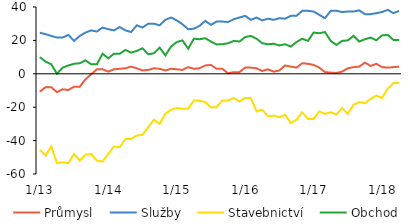
| Category | Průmysl | Služby | Stavebnictví | Obchod |
|---|---|---|---|---|
|  1/13 | -10.7 | 24.6 | -45.5 | 10 |
| 2 | -8 | 23.7 | -49 | 7.3 |
| 3 | -8 | 22.7 | -43.5 | 5.7 |
| 4 | -11 | 21.7 | -53.5 | 0 |
| 5 | -9.3 | 21.7 | -53 | 3.7 |
| 6 | -9.7 | 23.3 | -53.5 | 5 |
| 7 | -7.7 | 19.7 | -48 | 6 |
| 8 | -7.7 | 22.7 | -52 | 6.3 |
| 9 | -3.3 | 24.7 | -48.5 | 8 |
| 10 | -0.3 | 26 | -48 | 5.7 |
| 11 | 2.7 | 25.3 | -52 | 5.7 |
| 12 | 2.7 | 27.7 | -52.5 | 12 |
|  1/14 | 1.3 | 26.7 | -48 | 9.3 |
|  2 | 2.7 | 26 | -43.5 | 12 |
| 3 | 3 | 28 | -44 | 12 |
| 4 | 3.3 | 26 | -39 | 14.3 |
| 5 | 4.3 | 25 | -39 | 12.7 |
| 6 | 3.3 | 29 | -37 | 13.7 |
| 7 | 2 | 27.7 | -36.5 | 15.3 |
| 8 | 2.3 | 30 | -32 | 11.7 |
| 9 | 3.3 | 30 | -27.5 | 12.3 |
| 10 | 3 | 29 | -30 | 15.7 |
| 11 | 2 | 32.3 | -24 | 11 |
| 12 | 3 | 33.7 | -21.5 | 16.3 |
|  1/15 | 2.7 | 32 | -20.5 | 19 |
| 2 | 2.3 | 29.7 | -21 | 20 |
| 3 | 4 | 26.7 | -21 | 15 |
| 4 | 3 | 27 | -16 | 21 |
| 5 | 3.3 | 28.7 | -16 | 20.7 |
| 6 | 5 | 31.7 | -17 | 21.3 |
| 7 | 5.3 | 29.3 | -20 | 19.3 |
| 8 | 3 | 31.3 | -20 | 17.6 |
| 9 | 3 | 31.3 | -16 | 17.7 |
| 10 | 0.3 | 31 | -16 | 18.3 |
| 11 | 1 | 32.7 | -14.5 | 19.7 |
| 12 | 1 | 33.7 | -16.5 | 19.3 |
|  1/16 | 3.7 | 34.7 | -14.5 | 22 |
| 2 | 3.7 | 32.3 | -14.5 | 22.7 |
| 3 | 3.3 | 33.7 | -22.5 | 21 |
| 4 | 1.7 | 32 | -21.5 | 18.3 |
| 5 | 2.7 | 33 | -25.5 | 17.7 |
| 6 | 1.3 | 32.3 | -25 | 18 |
| 7 | 2 | 33.3 | -26 | 17 |
| 8 | 5 | 33 | -24.5 | 17.7 |
| 9 | 4.3 | 34.7 | -29.5 | 16.3 |
| 10 | 3.7 | 34.7 | -27.5 | 19 |
| 11 | 6.3 | 37.7 | -23 | 21 |
| 12 | 6 | 37.7 | -27 | 19.7 |
|  1/17 | 5.3 | 37.3 | -27 | 24.7 |
| 2 | 3.7 | 35.3 | -22.5 | 24.3 |
| 3 | 1 | 33.3 | -24 | 25 |
| 4 | 0.7 | 37.7 | -23 | 19.7 |
| 5 | 0.5 | 37.7 | -24.5 | 17.3 |
| 6 | 1.3 | 37 | -20.5 | 19.7 |
| 7 | 3.3 | 37.3 | -24 | 20 |
| 8 | 4 | 37.3 | -18.5 | 22.7 |
| 9 | 4.3 | 38 | -17 | 19.3 |
| 10 | 6.7 | 35.7 | -17.5 | 20.7 |
| 11 | 4.7 | 35.7 | -15 | 21.7 |
| 12 | 6 | 36.3 | -13 | 20.1 |
|  1/18 | 4 | 37 | -14.5 | 23 |
| 2 | 3.7 | 38.3 | -9 | 23.3 |
| 3 | 4 | 36.3 | -5.5 | 20.3 |
| 4 | 4.3 | 37.7 | -5.5 | 20.3 |